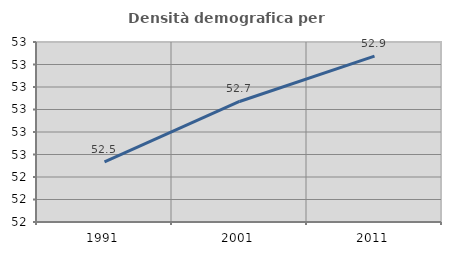
| Category | Densità demografica |
|---|---|
| 1991.0 | 52.467 |
| 2001.0 | 52.736 |
| 2011.0 | 52.937 |